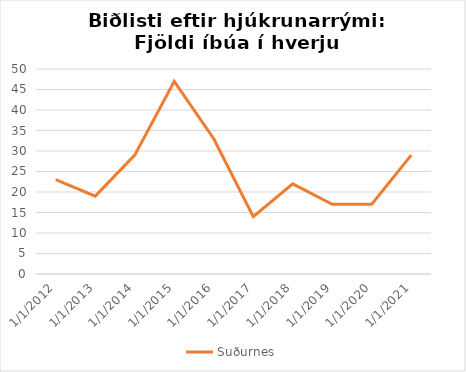
| Category | Suðurnes |
|---|---|
| 1/1/12 | 23 |
| 1/1/13 | 19 |
| 1/1/14 | 29 |
| 1/1/15 | 47 |
| 1/1/16 | 33 |
| 1/1/17 | 14 |
| 1/1/18 | 22 |
| 1/1/19 | 17 |
| 1/1/20 | 17 |
| 1/1/21 | 29 |